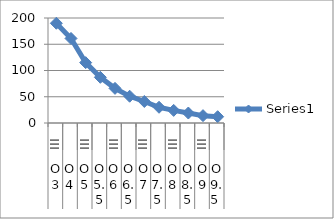
| Category | Series 0 |
|---|---|
| 0 | 190 |
| 1 | 161 |
| 2 | 115 |
| 3 | 87 |
| 4 | 66 |
| 5 | 51 |
| 6 | 41 |
| 7 | 30 |
| 8 | 24 |
| 9 | 19 |
| 10 | 14 |
| 11 | 12 |